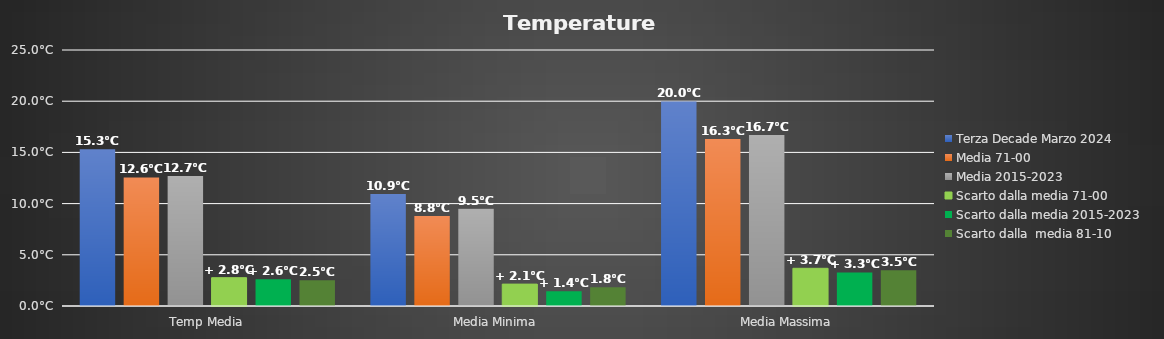
| Category | Terza Decade Marzo 2024 | Media 71-00 | Media 2015-2023 | Scarto dalla media 71-00 | Scarto dalla media 2015-2023 | Scarto dalla  media 81-10 |
|---|---|---|---|---|---|---|
| Temp Media | 15.316 | 12.55 | 12.7 | 2.766 | 2.616 | 2.516 |
| Media Minima  | 10.936 | 8.8 | 9.5 | 2.136 | 1.436 | 1.836 |
| Media Massima | 19.982 | 16.3 | 16.7 | 3.682 | 3.282 | 3.482 |